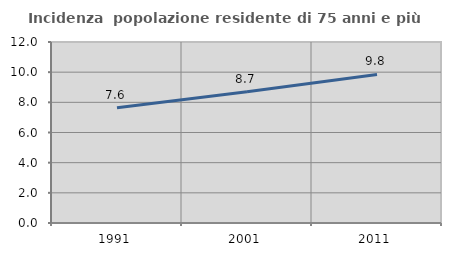
| Category | Incidenza  popolazione residente di 75 anni e più |
|---|---|
| 1991.0 | 7.644 |
| 2001.0 | 8.696 |
| 2011.0 | 9.847 |